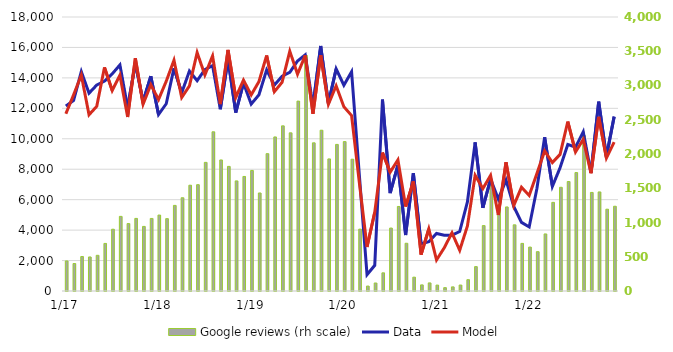
| Category | Google reviews (rh scale) |
|---|---|
| 2017-01-01 | 438.628 |
| 2017-02-01 | 401.069 |
| 2017-03-01 | 503.268 |
| 2017-04-01 | 496.897 |
| 2017-05-01 | 520.881 |
| 2017-06-01 | 694.406 |
| 2017-07-01 | 901.789 |
| 2017-08-01 | 1089.246 |
| 2017-09-01 | 984.303 |
| 2017-10-01 | 1059.703 |
| 2017-11-01 | 942.785 |
| 2017-12-01 | 1059.284 |
| 2018-01-01 | 1108.536 |
| 2018-02-01 | 1056.265 |
| 2018-03-01 | 1249.633 |
| 2018-04-01 | 1361.141 |
| 2018-05-01 | 1544.185 |
| 2018-06-01 | 1552.037 |
| 2018-07-01 | 1877.827 |
| 2018-08-01 | 2324 |
| 2018-09-01 | 1913 |
| 2018-10-01 | 1819 |
| 2018-11-01 | 1607 |
| 2018-12-01 | 1672 |
| 2019-01-01 | 1760 |
| 2019-02-01 | 1431 |
| 2019-03-01 | 2005 |
| 2019-04-01 | 2249 |
| 2019-05-01 | 2411 |
| 2019-06-01 | 2309 |
| 2019-07-01 | 2772 |
| 2019-08-01 | 3438 |
| 2019-09-01 | 2163 |
| 2019-10-01 | 2347 |
| 2019-11-01 | 1928 |
| 2019-12-01 | 2140 |
| 2020-01-01 | 2181 |
| 2020-02-01 | 1924 |
| 2020-03-01 | 903 |
| 2020-04-01 | 72 |
| 2020-05-01 | 117 |
| 2020-06-01 | 265 |
| 2020-07-01 | 919 |
| 2020-08-01 | 1234 |
| 2020-09-01 | 697 |
| 2020-10-01 | 202 |
| 2020-11-01 | 89 |
| 2020-12-01 | 118 |
| 2021-01-01 | 86 |
| 2021-02-01 | 49 |
| 2021-03-01 | 60 |
| 2021-04-01 | 87 |
| 2021-05-01 | 165 |
| 2021-06-01 | 356 |
| 2021-07-01 | 955 |
| 2021-08-01 | 1602 |
| 2021-09-01 | 1258 |
| 2021-10-01 | 1227 |
| 2021-11-01 | 966 |
| 2021-12-01 | 695 |
| 2022-01-01 | 641 |
| 2022-02-01 | 574 |
| 2022-03-01 | 833 |
| 2022-04-01 | 1294 |
| 2022-05-01 | 1514 |
| 2022-06-01 | 1598 |
| 2022-07-01 | 1729 |
| 2022-08-01 | 2268 |
| 2022-09-01 | 1439 |
| 2022-10-01 | 1446 |
| 2022-11-01 | 1194 |
| 2022-12-01 | 1237 |